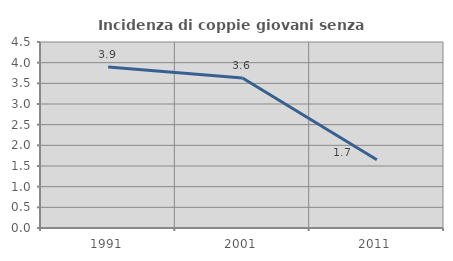
| Category | Incidenza di coppie giovani senza figli |
|---|---|
| 1991.0 | 3.893 |
| 2001.0 | 3.631 |
| 2011.0 | 1.65 |